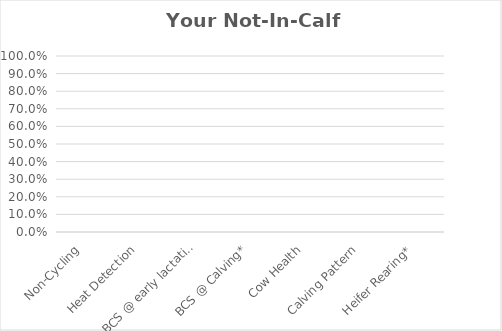
| Category | Not-In-Calf Rate Gap |
|---|---|
| Non-Cycling | 0 |
| Heat Detection | 0 |
| BCS @ early lactation | 0 |
| BCS @ Calving* | 0 |
| Cow Health | 0 |
| Calving Pattern | 0 |
| Heifer Rearing* | 0 |